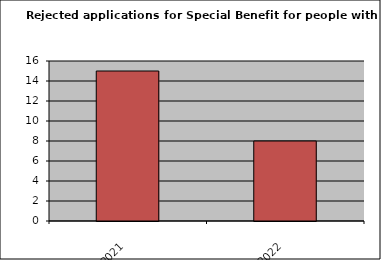
| Category | Series 0 |
|---|---|
| 2021.0 | 15 |
| 2022.0 | 8 |